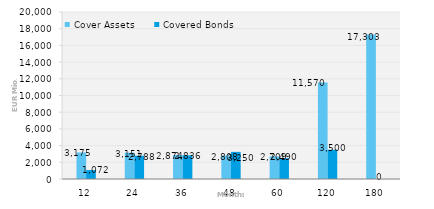
| Category | Cover Assets | Covered Bonds |
|---|---|---|
| 12.0 | 3174.668 | 1071.844 |
| 24.0 | 3151.226 | 2788 |
| 36.0 | 2874.136 | 2836.41 |
| 48.0 | 2807.576 | 3250 |
| 60.0 | 2708.82 | 2490 |
| 120.0 | 11570.059 | 3500 |
| 180.0 | 17302.844 | 0 |